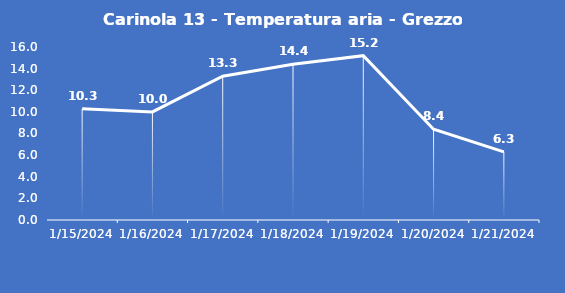
| Category | Carinola 13 - Temperatura aria - Grezzo (°C) |
|---|---|
| 1/15/24 | 10.3 |
| 1/16/24 | 10 |
| 1/17/24 | 13.3 |
| 1/18/24 | 14.4 |
| 1/19/24 | 15.2 |
| 1/20/24 | 8.4 |
| 1/21/24 | 6.3 |